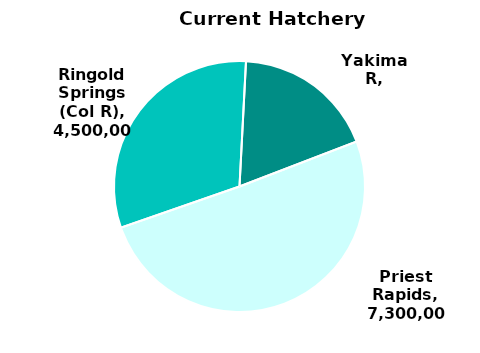
| Category | Series 0 |
|---|---|
| Priest Rapids | 7300000 |
| Ringold Springs (Col R) | 4500000 |
| Yakima R | 2650000 |